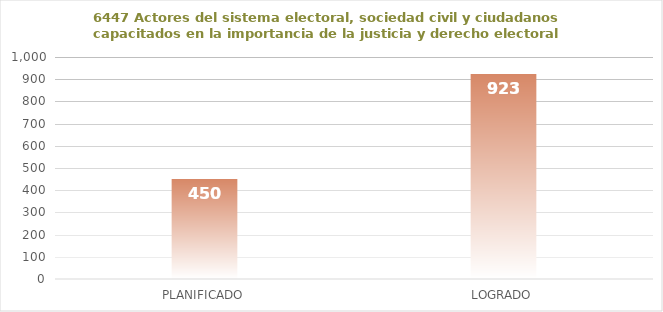
| Category | 6447 |
|---|---|
| PLANIFICADO | 450 |
| LOGRADO | 923 |